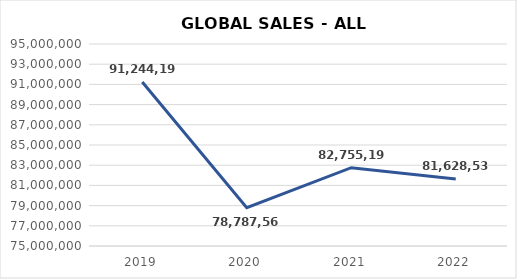
| Category | Series 0 |
|---|---|
| 2019.0 | 91244197 |
| 2020.0 | 78787566 |
| 2021.0 | 82755197 |
| 2022.0 | 81628533 |